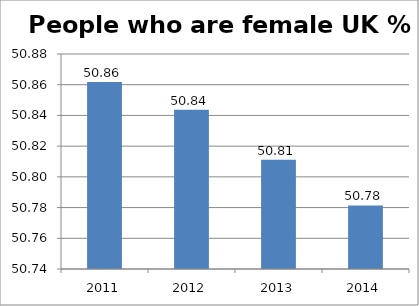
| Category | Series 0 |
|---|---|
| 2011 | 50.862 |
| 2012 | 50.844 |
| 2013 | 50.811 |
| 2014 | 50.781 |